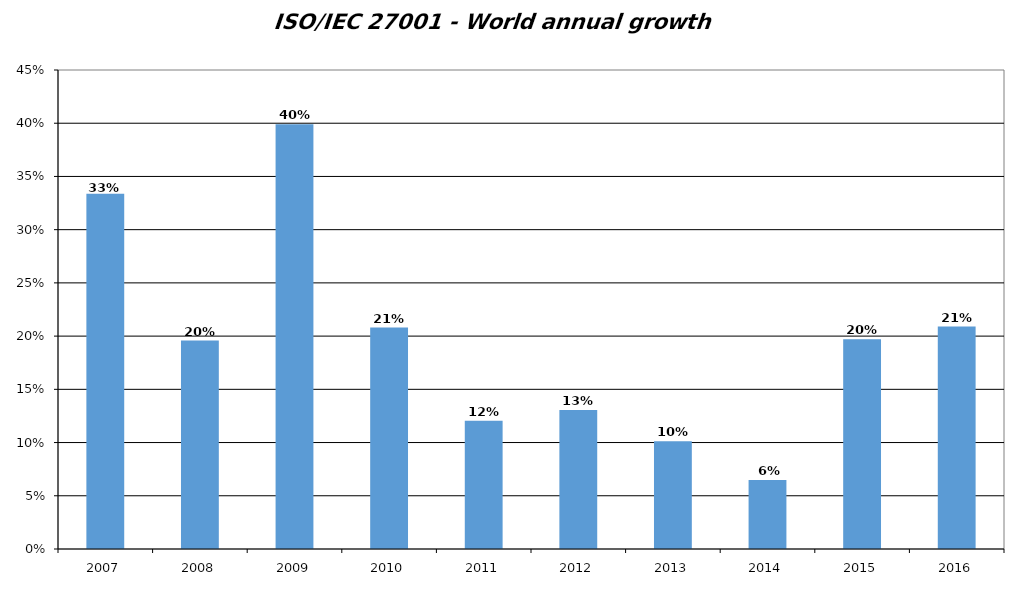
| Category | Series 0 |
|---|---|
| 2007.0 | 0.334 |
| 2008.0 | 0.196 |
| 2009.0 | 0.399 |
| 2010.0 | 0.208 |
| 2011.0 | 0.121 |
| 2012.0 | 0.131 |
| 2013.0 | 0.101 |
| 2014.0 | 0.065 |
| 2015.0 | 0.197 |
| 2016.0 | 0.209 |